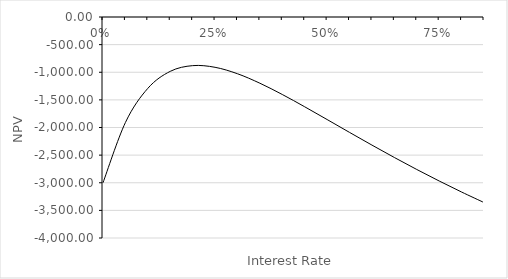
| Category | NPV |
|---|---|
| 0.0 | -3000 |
| 0.05 | -1909.637 |
| 0.1 | -1291.386 |
| 0.15000000000000002 | -983.622 |
| 0.2 | -880.144 |
| 0.25 | -910.4 |
| 0.3 | -1027.105 |
| 0.35 | -1198.363 |
| 0.39999999999999997 | -1402.57 |
| 0.44999999999999996 | -1625.076 |
| 0.49999999999999994 | -1855.967 |
| 0.5499999999999999 | -2088.577 |
| 0.6 | -2318.481 |
| 0.65 | -2542.803 |
| 0.7000000000000001 | -2759.738 |
| 0.7500000000000001 | -2968.228 |
| 0.8000000000000002 | -3167.725 |
| 0.8500000000000002 | -3358.035 |